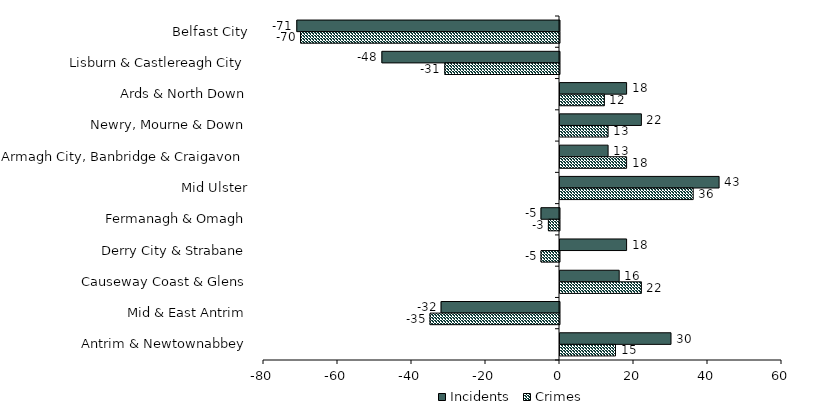
| Category | Incidents | Crimes |
|---|---|---|
| Belfast City | -71 | -70 |
| Lisburn & Castlereagh City | -48 | -31 |
| Ards & North Down | 18 | 12 |
| Newry, Mourne & Down | 22 | 13 |
| Armagh City, Banbridge & Craigavon | 13 | 18 |
| Mid Ulster | 43 | 36 |
| Fermanagh & Omagh | -5 | -3 |
| Derry City & Strabane | 18 | -5 |
| Causeway Coast & Glens | 16 | 22 |
| Mid & East Antrim | -32 | -35 |
| Antrim & Newtownabbey | 30 | 15 |